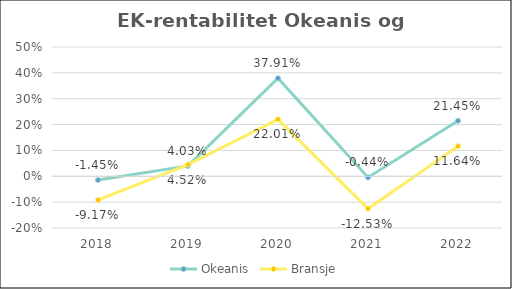
| Category | Okeanis | Bransje |
|---|---|---|
| 2018 | -0.015 | -0.092 |
| 2019 | 0.04 | 0.045 |
| 2020 | 0.379 | 0.22 |
| 2021 | -0.004 | -0.125 |
| 2022 | 0.215 | 0.116 |